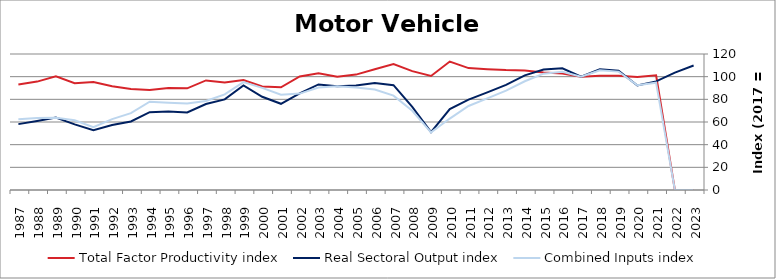
| Category | Total Factor Productivity index | Real Sectoral Output index | Combined Inputs index |
|---|---|---|---|
| 2023.0 | 0 | 109.805 | 0 |
| 2022.0 | 0 | 103.517 | 0 |
| 2021.0 | 101.169 | 95.84 | 94.732 |
| 2020.0 | 99.762 | 92.209 | 92.429 |
| 2019.0 | 100.744 | 105.234 | 104.458 |
| 2018.0 | 100.909 | 106.574 | 105.615 |
| 2017.0 | 100 | 100 | 100 |
| 2016.0 | 102.852 | 107.394 | 104.416 |
| 2015.0 | 103.59 | 106.342 | 102.657 |
| 2014.0 | 105.414 | 101.156 | 95.96 |
| 2013.0 | 105.805 | 92.788 | 87.696 |
| 2012.0 | 106.569 | 86.172 | 80.86 |
| 2011.0 | 107.577 | 79.756 | 74.138 |
| 2010.0 | 113.369 | 71.47 | 63.042 |
| 2009.0 | 100.63 | 51.162 | 50.842 |
| 2008.0 | 104.882 | 73.333 | 69.92 |
| 2007.0 | 111.057 | 92.501 | 83.292 |
| 2006.0 | 106.547 | 94.473 | 88.668 |
| 2005.0 | 101.825 | 92.167 | 90.515 |
| 2004.0 | 99.897 | 91.469 | 91.564 |
| 2003.0 | 103.085 | 93.168 | 90.379 |
| 2002.0 | 100.16 | 85.183 | 85.047 |
| 2001.0 | 90.568 | 76.069 | 83.992 |
| 2000.0 | 91.357 | 82.295 | 90.081 |
| 1999.0 | 96.953 | 92.294 | 95.194 |
| 1998.0 | 94.789 | 79.957 | 84.353 |
| 1997.0 | 96.659 | 75.888 | 78.511 |
| 1996.0 | 89.675 | 68.404 | 76.279 |
| 1995.0 | 90.086 | 69.281 | 76.905 |
| 1994.0 | 88.207 | 68.696 | 77.881 |
| 1993.0 | 89.206 | 60.483 | 67.801 |
| 1992.0 | 91.604 | 57.274 | 62.523 |
| 1991.0 | 95.288 | 52.78 | 55.39 |
| 1990.0 | 94.141 | 57.868 | 61.47 |
| 1989.0 | 100.232 | 63.88 | 63.732 |
| 1988.0 | 95.643 | 60.818 | 63.589 |
| 1987.0 | 93.049 | 58.117 | 62.459 |